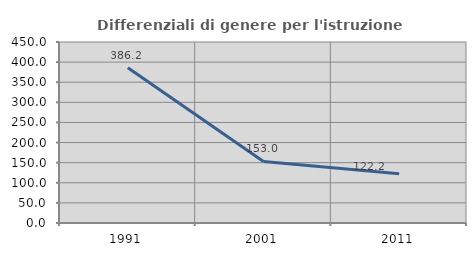
| Category | Differenziali di genere per l'istruzione superiore |
|---|---|
| 1991.0 | 386.207 |
| 2001.0 | 153.043 |
| 2011.0 | 122.222 |